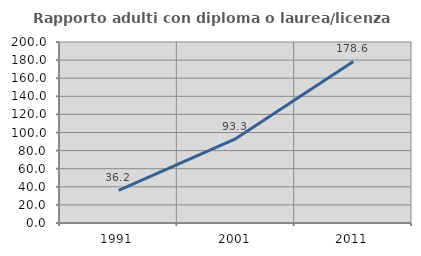
| Category | Rapporto adulti con diploma o laurea/licenza media  |
|---|---|
| 1991.0 | 36.17 |
| 2001.0 | 93.333 |
| 2011.0 | 178.571 |